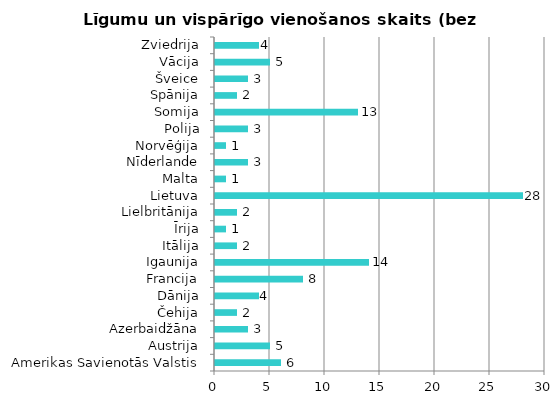
| Category | Līgumu un vispārīgo vienošanos skaits |
|---|---|
| Amerikas Savienotās Valstis | 6 |
| Austrija | 5 |
| Azerbaidžāna | 3 |
| Čehija | 2 |
| Dānija | 4 |
| Francija | 8 |
| Igaunija | 14 |
| Itālija | 2 |
| Īrija | 1 |
| Lielbritānija | 2 |
| Lietuva | 28 |
| Malta | 1 |
| Nīderlande | 3 |
| Norvēģija | 1 |
| Polija | 3 |
| Somija | 13 |
| Spānija | 2 |
| Šveice | 3 |
| Vācija | 5 |
| Zviedrija | 4 |